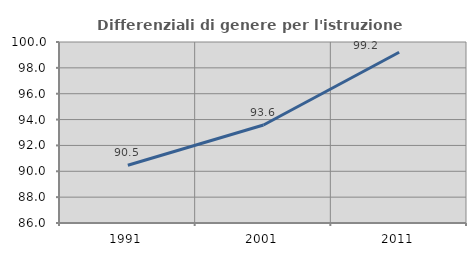
| Category | Differenziali di genere per l'istruzione superiore |
|---|---|
| 1991.0 | 90.466 |
| 2001.0 | 93.578 |
| 2011.0 | 99.203 |